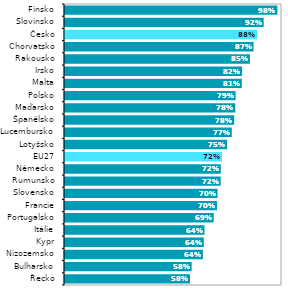
| Category | Series 1 |
|---|---|
| Řecko | 0.576 |
| Bulharsko | 0.584 |
| Nizozemsko | 0.636 |
| Kypr | 0.64 |
| Itálie | 0.643 |
| Portugalsko | 0.685 |
| Francie | 0.7 |
| Slovensko | 0.703 |
| Rumunsko | 0.717 |
| Německo | 0.718 |
| EU27 | 0.723 |
| Lotyšsko | 0.747 |
| Lucembursko | 0.769 |
| Španělsko | 0.78 |
| Maďarsko | 0.785 |
| Polsko | 0.786 |
| Malta | 0.815 |
| Irsko | 0.816 |
| Rakousko | 0.852 |
| Chorvatsko | 0.869 |
| Česko | 0.885 |
| Slovinsko | 0.915 |
| Finsko | 0.979 |